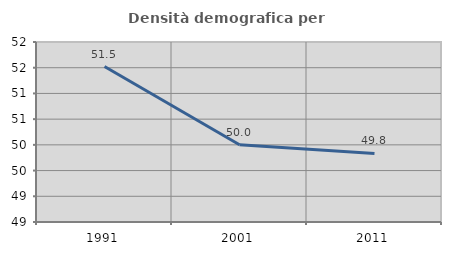
| Category | Densità demografica |
|---|---|
| 1991.0 | 51.523 |
| 2001.0 | 50.003 |
| 2011.0 | 49.834 |